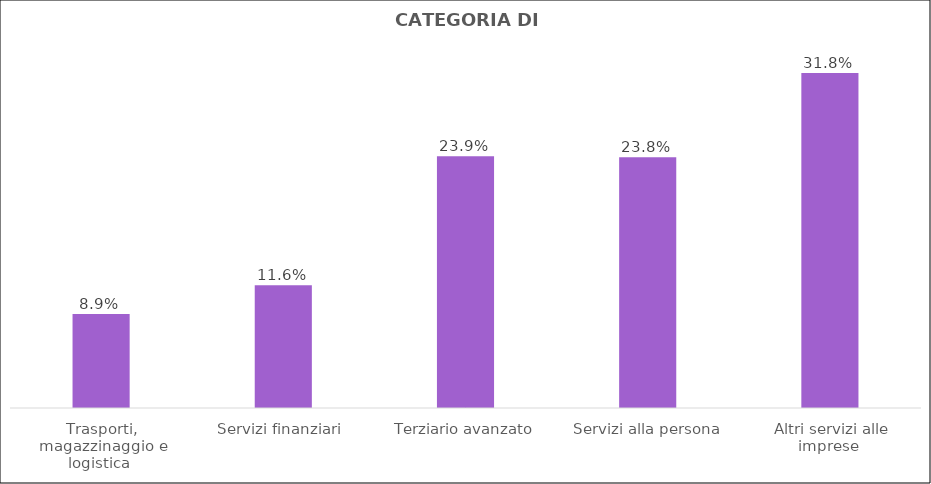
| Category | Series 0 |
|---|---|
| Trasporti, magazzinaggio e logistica  | 0.089 |
| Servizi finanziari  | 0.116 |
| Terziario avanzato | 0.239 |
| Servizi alla persona | 0.238 |
| Altri servizi alle imprese  | 0.318 |